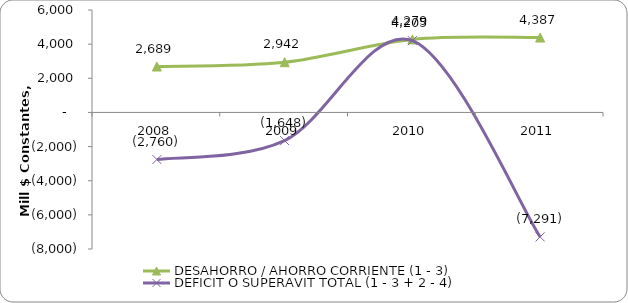
| Category | DESAHORRO / AHORRO CORRIENTE (1 - 3) | DEFICIT O SUPERAVIT TOTAL (1 - 3 + 2 - 4) |
|---|---|---|
| 2008.0 | 2689.305 | -2759.972 |
| 2009.0 | 2941.76 | -1648.397 |
| 2010.0 | 4278.575 | 4204.699 |
| 2011.0 | 4387 | -7291 |